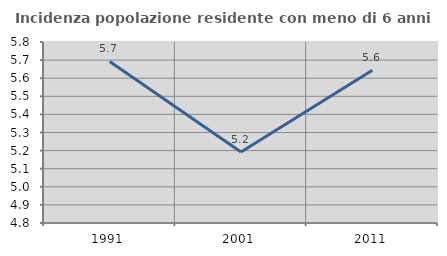
| Category | Incidenza popolazione residente con meno di 6 anni |
|---|---|
| 1991.0 | 5.693 |
| 2001.0 | 5.192 |
| 2011.0 | 5.644 |